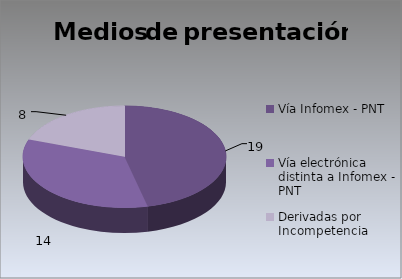
| Category | Series 0 |
|---|---|
| Vía Infomex - PNT | 19 |
| Vía electrónica distinta a Infomex - PNT | 14 |
| Derivadas por Incompetencia | 8 |